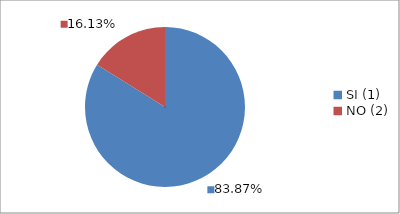
| Category | Series 0 |
|---|---|
| SI (1) | 0.839 |
| NO (2) | 0.161 |